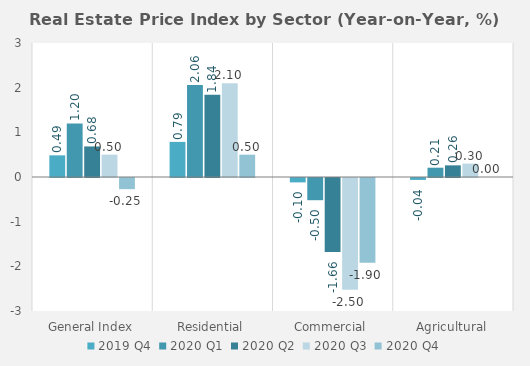
| Category | 2019 | 2020 |
|---|---|---|
| General Index | 0.485 | -0.25 |
| Residential | 0.786 | 0.5 |
| Commercial | -0.098 | -1.9 |
| Agricultural | -0.043 | 0 |